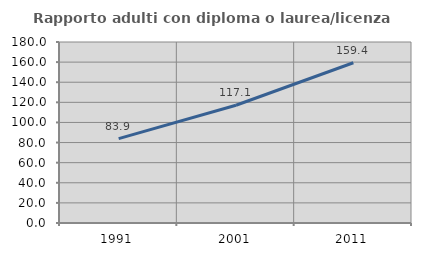
| Category | Rapporto adulti con diploma o laurea/licenza media  |
|---|---|
| 1991.0 | 83.855 |
| 2001.0 | 117.111 |
| 2011.0 | 159.392 |